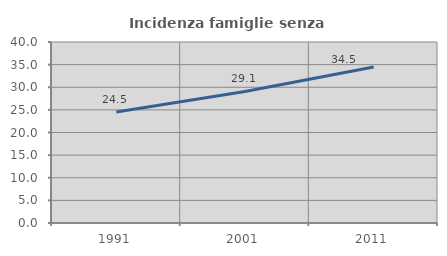
| Category | Incidenza famiglie senza nuclei |
|---|---|
| 1991.0 | 24.52 |
| 2001.0 | 29.066 |
| 2011.0 | 34.477 |